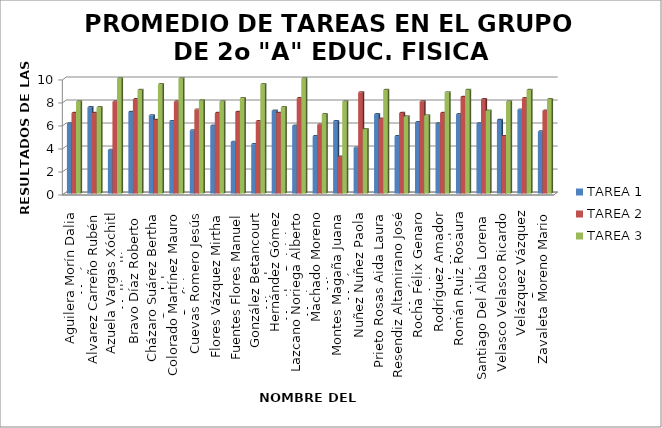
| Category | TAREA 1 | TAREA 2 | TAREA 3 |
|---|---|---|---|
| Aguilera Morín Dalia María | 6.1 | 7 | 8 |
| Alvarez Carreño Rubén | 7.5 | 7 | 7.5 |
| Azuela Vargas Xóchitl Mallinalli | 3.8 | 8 | 10 |
| Bravo Díaz Roberto  | 7.1 | 8.2 | 9 |
| Cházaro Suárez Bertha Guadalupe | 6.8 | 6.4 | 9.5 |
| Colorado Martínez Mauro Porfirio | 6.3 | 8 | 10 |
| Cuevas Romero Jesús | 5.5 | 7.3 | 8.1 |
| Flores Vázquez Mirtha | 5.9 | 7 | 8 |
| Fuentes Flores Manuel | 4.5 | 7.1 | 8.3 |
| González Betancourt Miroslava | 4.3 | 6.3 | 9.5 |
| Hernández Gómez Martha Patricia | 7.2 | 7 | 7.5 |
| Lazcano Noriega Alberto Mariano | 5.9 | 8.3 | 10 |
| Machado Moreno Minerva | 5 | 6 | 6.9 |
| Montes Magaña Juana María | 6.3 | 3.2 | 8 |
| Nuñez Nuñez Paola | 4 | 8.8 | 5.6 |
| Prieto Rosas Aida Laura | 6.9 | 6.5 | 9 |
| Resendiz Altamirano José María | 5 | 7 | 6.7 |
| Rocha Félix Genaro Arturo | 6.2 | 8 | 6.8 |
| Rodríguez Amador Amanda Martha | 6.1 | 7 | 8.8 |
| Román Ruiz Rosaura María | 6.9 | 8.4 | 9 |
| Santiago Del Alba Lorena | 6.1 | 8.2 | 7.2 |
| Velasco Velasco Ricardo | 6.4 | 5 | 8 |
| Velázquez Vázquez Ramona | 7.3 | 8.3 | 9 |
| Zavaleta Moreno Mario | 5.4 | 7.2 | 8.2 |